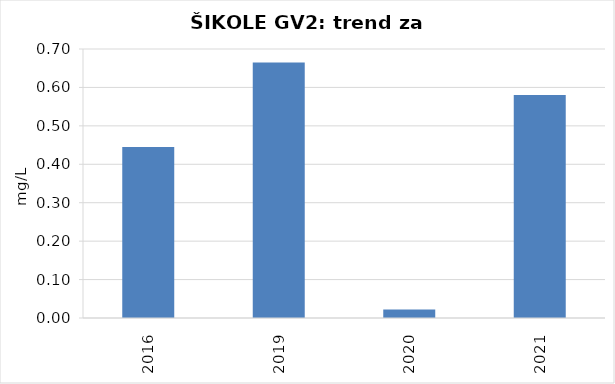
| Category | Vsota |
|---|---|
| 2016 | 0.445 |
| 2019 | 0.665 |
| 2020 | 0.022 |
| 2021 | 0.58 |